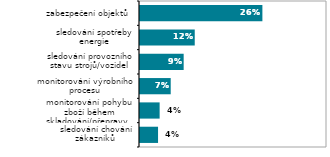
| Category | Series 0 |
|---|---|
| sledování chování zákazníků  | 0.039 |
| monitorování pohybu zboží během skladování/přepravy   | 0.042 |
| monitorování výrobního procesu | 0.066 |
| sledování provozního stavu strojů/vozidel  | 0.093 |
| sledování spotřeby energie | 0.117 |
| zabezpečení objektů  | 0.262 |